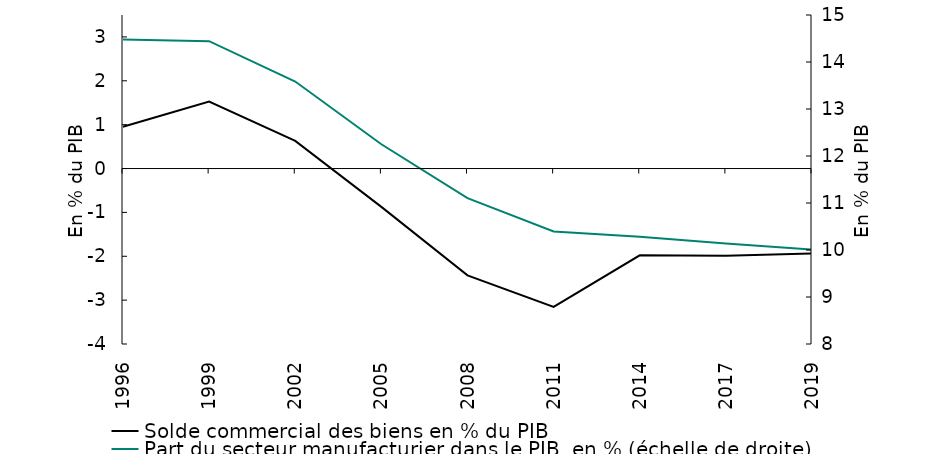
| Category | Solde commercial des biens en % du PIB |
|---|---|
| 1996.0 | 0.951 |
| 1999.0 | 1.527 |
| 2002.0 | 0.631 |
| 2005.0 | -0.874 |
| 2008.0 | -2.435 |
| 2011.0 | -3.154 |
| 2014.0 | -1.978 |
| 2017.0 | -1.986 |
| 2019.0 | -1.936 |